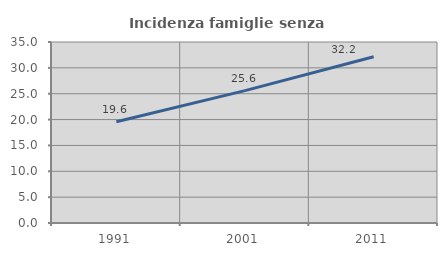
| Category | Incidenza famiglie senza nuclei |
|---|---|
| 1991.0 | 19.591 |
| 2001.0 | 25.602 |
| 2011.0 | 32.159 |